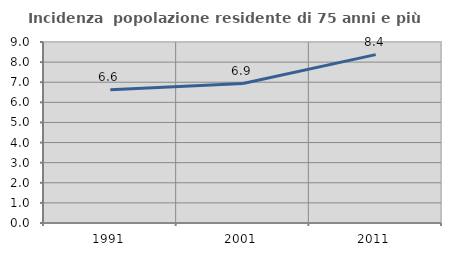
| Category | Incidenza  popolazione residente di 75 anni e più |
|---|---|
| 1991.0 | 6.628 |
| 2001.0 | 6.933 |
| 2011.0 | 8.372 |